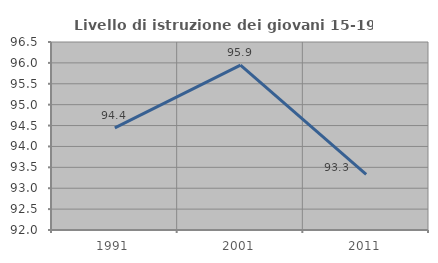
| Category | Livello di istruzione dei giovani 15-19 anni |
|---|---|
| 1991.0 | 94.444 |
| 2001.0 | 95.946 |
| 2011.0 | 93.333 |